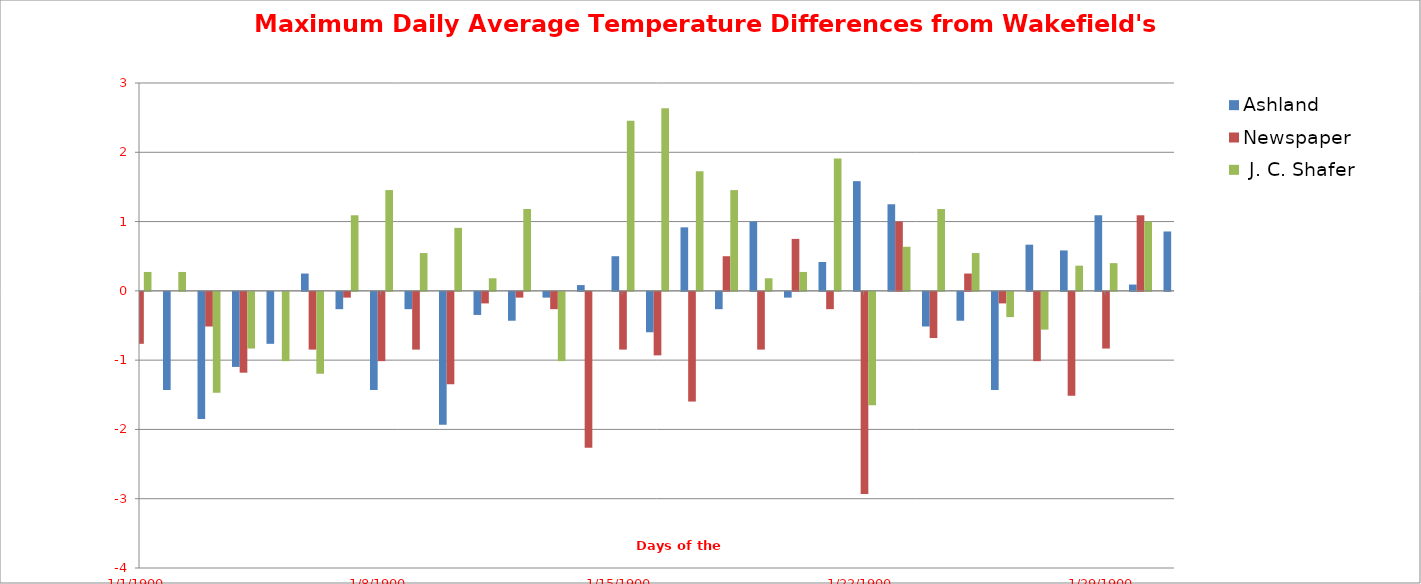
| Category | Ashland  | Newspaper |  J. C. Shafer |
|---|---|---|---|
| 0 | -2.083 | -0.75 | 0.273 |
| 1 | -1.417 | 0 | 0.273 |
| 2 | -1.833 | -0.5 | -1.455 |
| 3 | -1.083 | -1.167 | -0.818 |
| 4 | -0.75 | 0 | -1 |
| 5 | 0.25 | -0.833 | -1.182 |
| 6 | -0.25 | -0.083 | 1.091 |
| 7 | -1.417 | -1 | 1.455 |
| 8 | -0.25 | -0.833 | 0.545 |
| 9 | -1.917 | -1.333 | 0.909 |
| 10 | -0.333 | -0.167 | 0.182 |
| 11 | -0.417 | -0.083 | 1.182 |
| 12 | -0.083 | -0.25 | -1 |
| 13 | 0.083 | -2.25 | 0 |
| 14 | 0.5 | -0.833 | 2.455 |
| 15 | -0.583 | -0.917 | 2.636 |
| 16 | 0.917 | -1.583 | 1.727 |
| 17 | -0.25 | 0.5 | 1.455 |
| 18 | 1 | -0.833 | 0.182 |
| 19 | -0.083 | 0.75 | 0.273 |
| 20 | 0.417 | -0.25 | 1.909 |
| 21 | 1.583 | -2.917 | -1.636 |
| 22 | 1.25 | 1 | 0.636 |
| 23 | -0.5 | -0.667 | 1.182 |
| 24 | -0.417 | 0.25 | 0.545 |
| 25 | -1.417 | -0.167 | -0.364 |
| 26 | 0.667 | -1 | -0.545 |
| 27 | 0.583 | -1.5 | 0.364 |
| 28 | 1.091 | -0.818 | 0.4 |
| 29 | 0.091 | 1.091 | 1 |
| 30 | 0.857 | 0 | -1 |